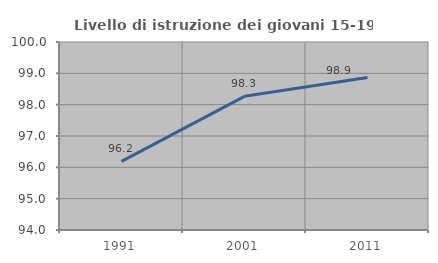
| Category | Livello di istruzione dei giovani 15-19 anni |
|---|---|
| 1991.0 | 96.192 |
| 2001.0 | 98.266 |
| 2011.0 | 98.868 |